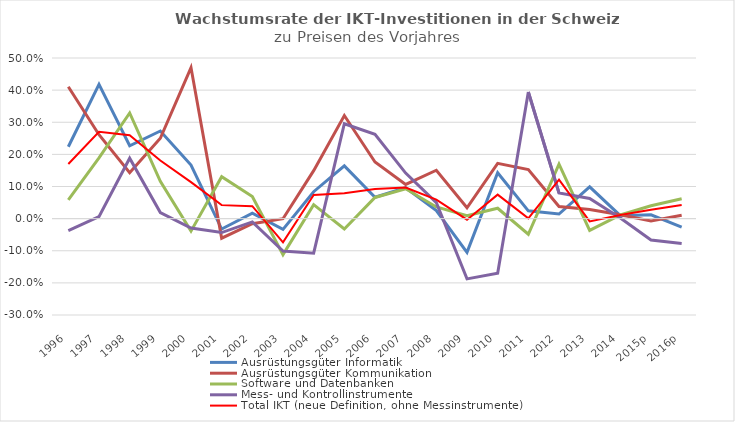
| Category | Ausrüstungsgüter Informatik | Ausrüstungsgüter Kommunikation | Software und Datenbanken | Mess- und Kontrollinstrumente | Total IKT (neue Definition, ohne Messinstrumente) |
|---|---|---|---|---|---|
| 1996 | 0.224 | 0.41 | 0.058 | -0.037 | 0.17 |
| 1997 | 0.418 | 0.261 | 0.189 | 0.006 | 0.27 |
| 1998 | 0.227 | 0.143 | 0.329 | 0.188 | 0.26 |
| 1999 | 0.273 | 0.25 | 0.116 | 0.019 | 0.181 |
| 2000 | 0.167 | 0.47 | -0.039 | -0.029 | 0.113 |
| 2001 | -0.033 | -0.061 | 0.131 | -0.043 | 0.042 |
| 2002 | 0.017 | -0.016 | 0.069 | -0.01 | 0.039 |
| 2003 | -0.033 | 0 | -0.112 | -0.101 | -0.074 |
| 2004 | 0.084 | 0.149 | 0.043 | -0.108 | 0.074 |
| 2005 | 0.164 | 0.321 | -0.032 | 0.295 | 0.079 |
| 2006 | 0.067 | 0.176 | 0.066 | 0.262 | 0.092 |
| 2007 | 0.096 | 0.106 | 0.093 | 0.142 | 0.097 |
| 2008 | 0.025 | 0.151 | 0.036 | 0.05 | 0.059 |
| 2009 | -0.105 | 0.034 | 0.009 | -0.188 | -0.003 |
| 2010 | 0.143 | 0.172 | 0.032 | -0.17 | 0.075 |
| 2011 | 0.024 | 0.153 | -0.049 | 0.394 | 0.001 |
| 2012 | 0.014 | 0.038 | 0.17 | 0.08 | 0.121 |
| 2013 | 0.099 | 0.028 | -0.037 | 0.063 | -0.009 |
| 2014 | 0.009 | 0.012 | 0.011 | 0.002 | 0.011 |
| 2015p | 0.012 | -0.007 | 0.04 | -0.066 | 0.028 |
| 2016p | -0.026 | 0.01 | 0.062 | -0.077 | 0.043 |